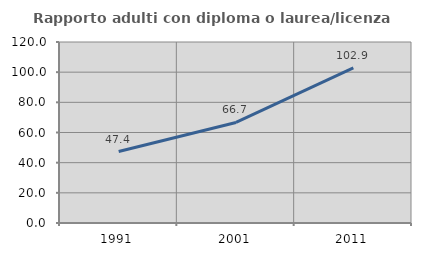
| Category | Rapporto adulti con diploma o laurea/licenza media  |
|---|---|
| 1991.0 | 47.368 |
| 2001.0 | 66.667 |
| 2011.0 | 102.857 |